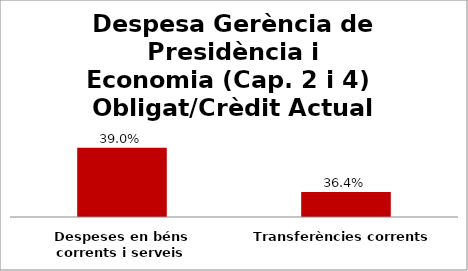
| Category | Series 0 |
|---|---|
| Despeses en béns corrents i serveis | 0.39 |
| Transferències corrents | 0.364 |